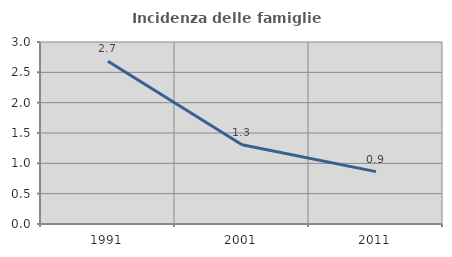
| Category | Incidenza delle famiglie numerose |
|---|---|
| 1991.0 | 2.682 |
| 2001.0 | 1.306 |
| 2011.0 | 0.863 |